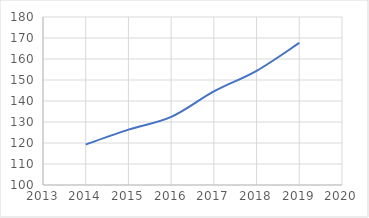
| Category | Series 0 |
|---|---|
| 2014.0 | 119.289 |
| 2015.0 | 126.359 |
| 2016.0 | 132.436 |
| 2017.0 | 144.564 |
| 2018.0 | 154.374 |
| 2019.0 | 167.661 |